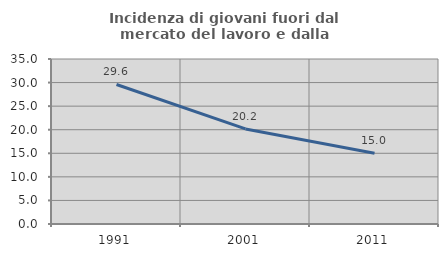
| Category | Incidenza di giovani fuori dal mercato del lavoro e dalla formazione  |
|---|---|
| 1991.0 | 29.6 |
| 2001.0 | 20.166 |
| 2011.0 | 15.005 |